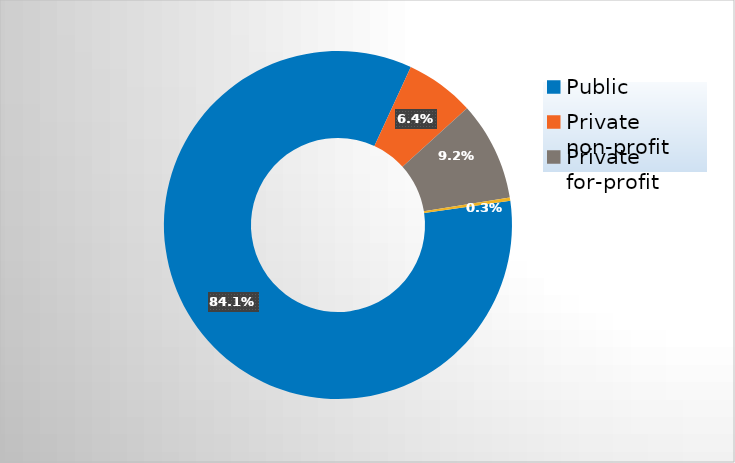
| Category | Series 0 |
|---|---|
| Public | 0.841 |
| Private non-profit | 0.064 |
| Private for-profit | 0.092 |
| Private, state-related | 0.003 |